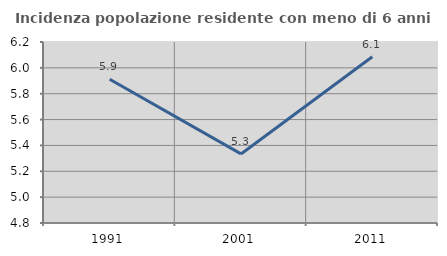
| Category | Incidenza popolazione residente con meno di 6 anni |
|---|---|
| 1991.0 | 5.912 |
| 2001.0 | 5.334 |
| 2011.0 | 6.086 |